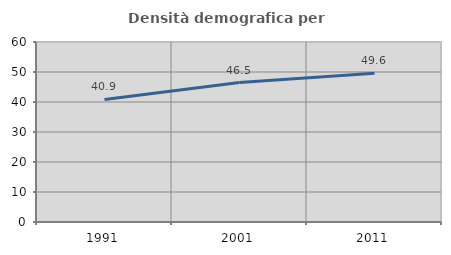
| Category | Densità demografica |
|---|---|
| 1991.0 | 40.87 |
| 2001.0 | 46.48 |
| 2011.0 | 49.585 |